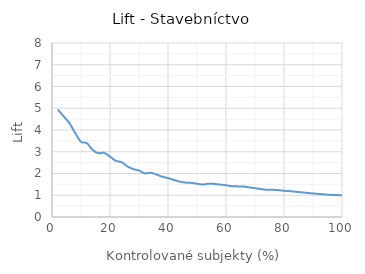
| Category | Stavebníctvo |
|---|---|
| 2.0 | 4.938 |
| 4.0 | 4.63 |
| 6.0 | 4.321 |
| 8.0 | 3.858 |
| 10.0 | 3.457 |
| 12.0 | 3.395 |
| 14.0 | 3.086 |
| 16.0 | 2.932 |
| 18.0 | 2.949 |
| 20.0 | 2.778 |
| 22.0 | 2.581 |
| 24.0 | 2.521 |
| 26.0 | 2.327 |
| 28.0 | 2.205 |
| 30.0 | 2.14 |
| 32.0 | 2.006 |
| 34.0 | 2.033 |
| 36.0 | 1.955 |
| 38.0 | 1.852 |
| 40.0 | 1.79 |
| 42.0 | 1.705 |
| 44.0 | 1.627 |
| 46.0 | 1.583 |
| 48.0 | 1.569 |
| 50.0 | 1.531 |
| 52.0 | 1.496 |
| 54.0 | 1.532 |
| 56.0 | 1.521 |
| 58.0 | 1.49 |
| 60.0 | 1.461 |
| 62.0 | 1.414 |
| 64.0 | 1.408 |
| 66.0 | 1.403 |
| 68.0 | 1.362 |
| 70.0 | 1.323 |
| 72.0 | 1.286 |
| 74.0 | 1.251 |
| 76.0 | 1.251 |
| 78.0 | 1.235 |
| 80.0 | 1.204 |
| 82.0 | 1.189 |
| 84.0 | 1.161 |
| 86.0 | 1.134 |
| 88.0 | 1.108 |
| 90.0 | 1.084 |
| 92.0 | 1.06 |
| 94.0 | 1.038 |
| 96.0 | 1.016 |
| 98.0 | 1.008 |
| 100.0 | 1 |